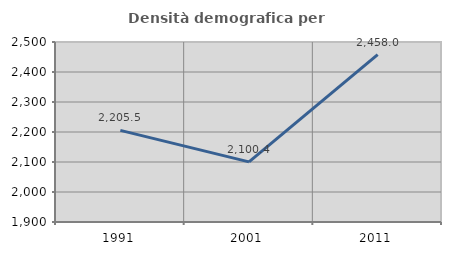
| Category | Densità demografica |
|---|---|
| 1991.0 | 2205.53 |
| 2001.0 | 2100.432 |
| 2011.0 | 2458.026 |